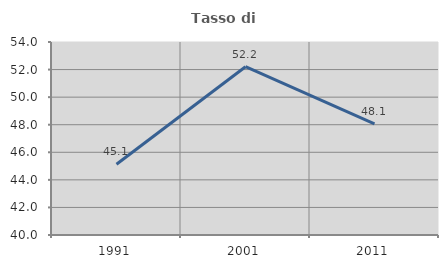
| Category | Tasso di occupazione   |
|---|---|
| 1991.0 | 45.136 |
| 2001.0 | 52.207 |
| 2011.0 | 48.065 |